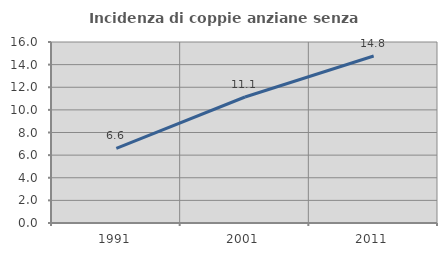
| Category | Incidenza di coppie anziane senza figli  |
|---|---|
| 1991.0 | 6.599 |
| 2001.0 | 11.139 |
| 2011.0 | 14.761 |